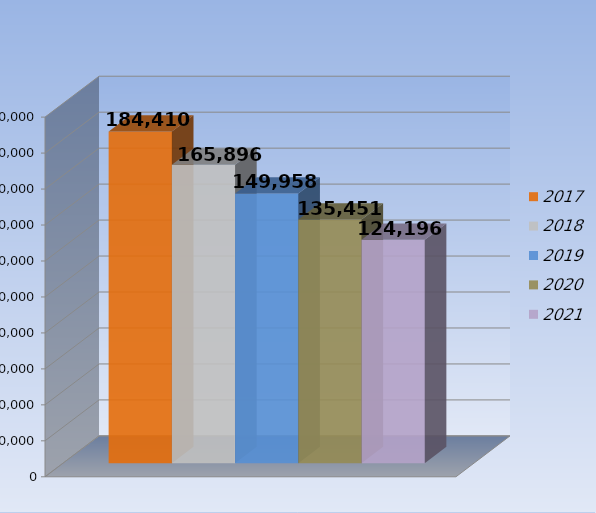
| Category | 2017 | 2018 | 2019 | 2020 | 2021 |
|---|---|---|---|---|---|
| 0 | 184410 | 165896 | 149958 | 135451 | 124196 |